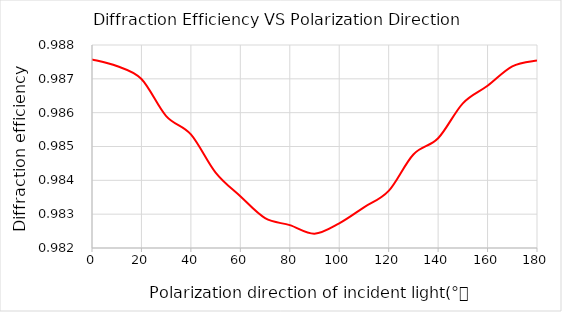
| Category | Series 0 |
|---|---|
| 0.0 | 0.988 |
| 10.0 | 0.987 |
| 20.0 | 0.987 |
| 30.0 | 0.986 |
| 40.0 | 0.985 |
| 50.0 | 0.984 |
| 60.0 | 0.984 |
| 70.0 | 0.983 |
| 80.0 | 0.983 |
| 90.0 | 0.982 |
| 100.0 | 0.983 |
| 110.0 | 0.983 |
| 120.0 | 0.984 |
| 130.0 | 0.985 |
| 140.0 | 0.985 |
| 150.0 | 0.986 |
| 160.0 | 0.987 |
| 170.0 | 0.987 |
| 180.0 | 0.988 |